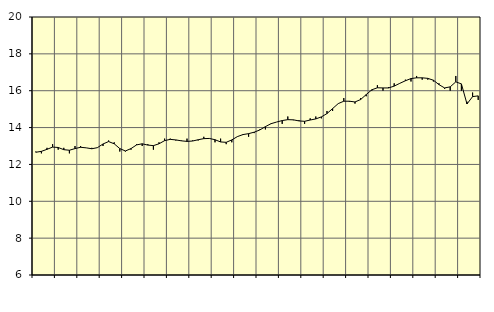
| Category | Piggar | Utbildning, SNI 85 |
|---|---|---|
| nan | 12.7 | 12.66 |
| 1.0 | 12.6 | 12.71 |
| 1.0 | 12.9 | 12.82 |
| 1.0 | 13.1 | 12.94 |
| nan | 12.8 | 12.92 |
| 2.0 | 12.9 | 12.8 |
| 2.0 | 12.6 | 12.77 |
| 2.0 | 13 | 12.86 |
| nan | 13 | 12.93 |
| 3.0 | 12.9 | 12.9 |
| 3.0 | 12.9 | 12.85 |
| 3.0 | 12.9 | 12.91 |
| nan | 13 | 13.11 |
| 4.0 | 13.3 | 13.24 |
| 4.0 | 13.2 | 13.12 |
| 4.0 | 12.7 | 12.86 |
| nan | 12.7 | 12.73 |
| 5.0 | 12.8 | 12.86 |
| 5.0 | 13.1 | 13.06 |
| 5.0 | 13 | 13.12 |
| nan | 13.1 | 13.05 |
| 6.0 | 12.8 | 13.02 |
| 6.0 | 13.2 | 13.12 |
| 6.0 | 13.4 | 13.29 |
| nan | 13.4 | 13.36 |
| 7.0 | 13.3 | 13.33 |
| 7.0 | 13.3 | 13.28 |
| 7.0 | 13.4 | 13.25 |
| nan | 13.3 | 13.27 |
| 8.0 | 13.3 | 13.34 |
| 8.0 | 13.5 | 13.4 |
| 8.0 | 13.4 | 13.41 |
| nan | 13.2 | 13.34 |
| 9.0 | 13.4 | 13.22 |
| 9.0 | 13.1 | 13.2 |
| 9.0 | 13.2 | 13.33 |
| nan | 13.5 | 13.51 |
| 10.0 | 13.6 | 13.62 |
| 10.0 | 13.5 | 13.67 |
| 10.0 | 13.7 | 13.75 |
| nan | 13.9 | 13.87 |
| 11.0 | 13.9 | 14.05 |
| 11.0 | 14.2 | 14.21 |
| 11.0 | 14.3 | 14.3 |
| nan | 14.2 | 14.38 |
| 12.0 | 14.6 | 14.43 |
| 12.0 | 14.4 | 14.42 |
| 12.0 | 14.4 | 14.36 |
| nan | 14.2 | 14.34 |
| 13.0 | 14.5 | 14.41 |
| 13.0 | 14.6 | 14.47 |
| 13.0 | 14.5 | 14.58 |
| nan | 14.9 | 14.76 |
| 14.0 | 14.9 | 15.03 |
| 14.0 | 15.3 | 15.3 |
| 14.0 | 15.6 | 15.43 |
| nan | 15.4 | 15.43 |
| 15.0 | 15.3 | 15.39 |
| 15.0 | 15.6 | 15.52 |
| 15.0 | 15.7 | 15.79 |
| nan | 16 | 16.05 |
| 16.0 | 16.3 | 16.16 |
| 16.0 | 16 | 16.15 |
| 16.0 | 16.2 | 16.15 |
| nan | 16.4 | 16.25 |
| 17.0 | 16.4 | 16.4 |
| 17.0 | 16.6 | 16.54 |
| 17.0 | 16.5 | 16.66 |
| nan | 16.8 | 16.7 |
| 18.0 | 16.6 | 16.7 |
| 18.0 | 16.6 | 16.67 |
| 18.0 | 16.5 | 16.57 |
| nan | 16.4 | 16.33 |
| 19.0 | 16.1 | 16.15 |
| 19.0 | 16 | 16.21 |
| 19.0 | 16.8 | 16.48 |
| nan | 16 | 16.37 |
| 20.0 | 15.4 | 15.28 |
| 20.0 | 15.9 | 15.68 |
| 20.0 | 15.5 | 15.72 |